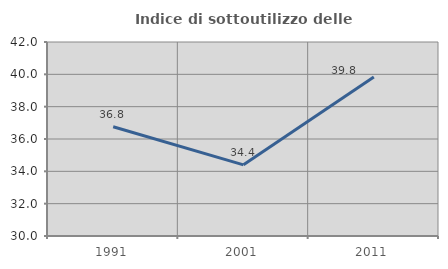
| Category | Indice di sottoutilizzo delle abitazioni  |
|---|---|
| 1991.0 | 36.756 |
| 2001.0 | 34.403 |
| 2011.0 | 39.828 |